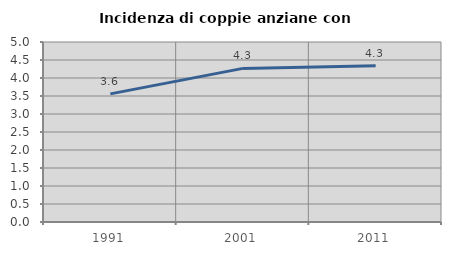
| Category | Incidenza di coppie anziane con figli |
|---|---|
| 1991.0 | 3.56 |
| 2001.0 | 4.267 |
| 2011.0 | 4.343 |